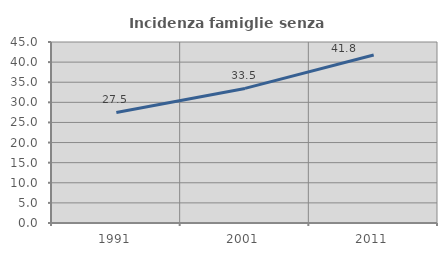
| Category | Incidenza famiglie senza nuclei |
|---|---|
| 1991.0 | 27.494 |
| 2001.0 | 33.463 |
| 2011.0 | 41.761 |